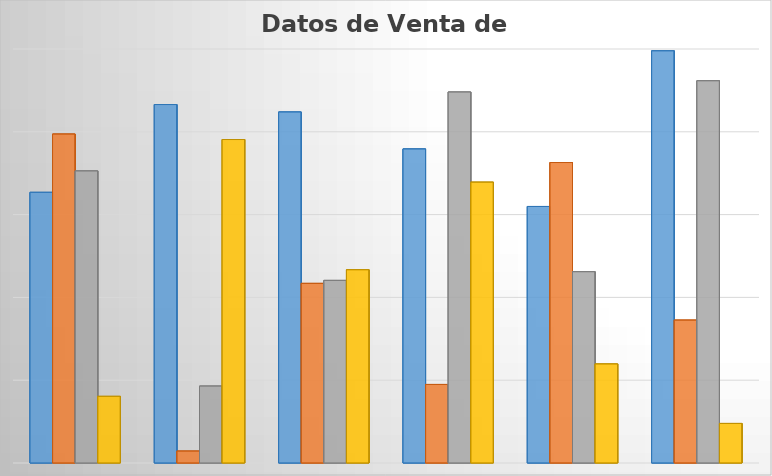
| Category | Series 0 | Series 1 | Series 2 | Series 3 |
|---|---|---|---|---|
| 0 | 32689 | 39728 | 35275 | 8049 |
| 1 | 43293 | 1441 | 9290 | 39067 |
| 2 | 42396 | 21693 | 22053 | 23341 |
| 3 | 37933 | 9486 | 44807 | 33919 |
| 4 | 30981 | 36289 | 23107 | 11964 |
| 5 | 49784 | 17258 | 46166 | 4778 |